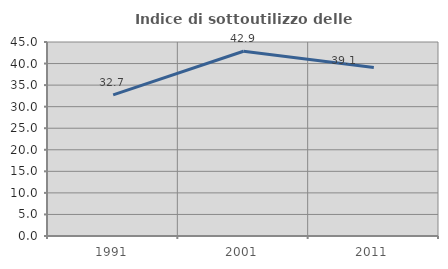
| Category | Indice di sottoutilizzo delle abitazioni  |
|---|---|
| 1991.0 | 32.75 |
| 2001.0 | 42.857 |
| 2011.0 | 39.091 |